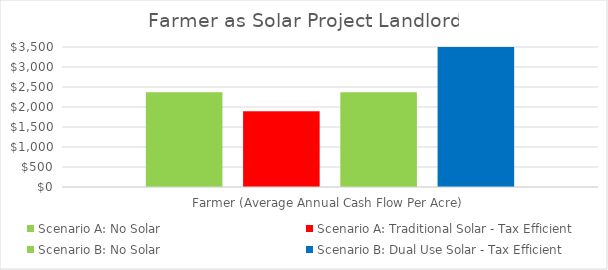
| Category | Scenario A: No Solar | Scenario A: Traditional Solar - Tax Efficient | Scenario B: No Solar | Scenario B: Dual Use Solar - Tax Efficient |
|---|---|---|---|---|
| Farmer (Average Annual Cash Flow Per Acre) | 2366.471 | 1893.177 | 2366.471 | 3786.354 |